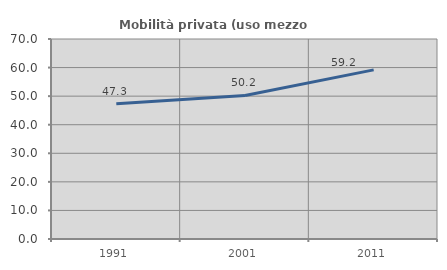
| Category | Mobilità privata (uso mezzo privato) |
|---|---|
| 1991.0 | 47.323 |
| 2001.0 | 50.225 |
| 2011.0 | 59.184 |